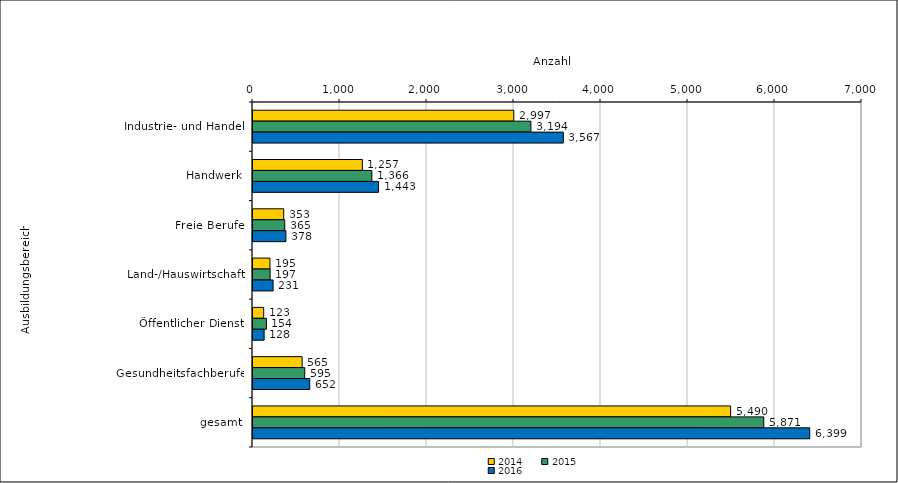
| Category | 2014 | 2015 | 2016 |
|---|---|---|---|
| Industrie- und Handel | 2997 | 3194 | 3567 |
| Handwerk | 1257 | 1366 | 1443 |
| Freie Berufe | 353 | 365 | 378 |
| Land-/Hauswirtschaft | 195 | 197 | 231 |
| Öffentlicher Dienst | 123 | 154 | 128 |
| Gesundheitsfachberufe | 565 | 595 | 652 |
| gesamt | 5490 | 5871 | 6399 |